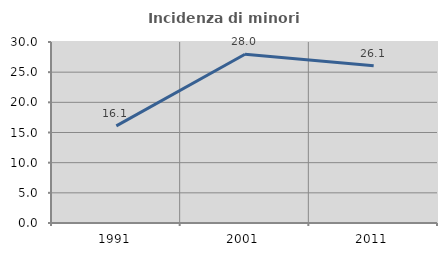
| Category | Incidenza di minori stranieri |
|---|---|
| 1991.0 | 16.092 |
| 2001.0 | 27.963 |
| 2011.0 | 26.052 |